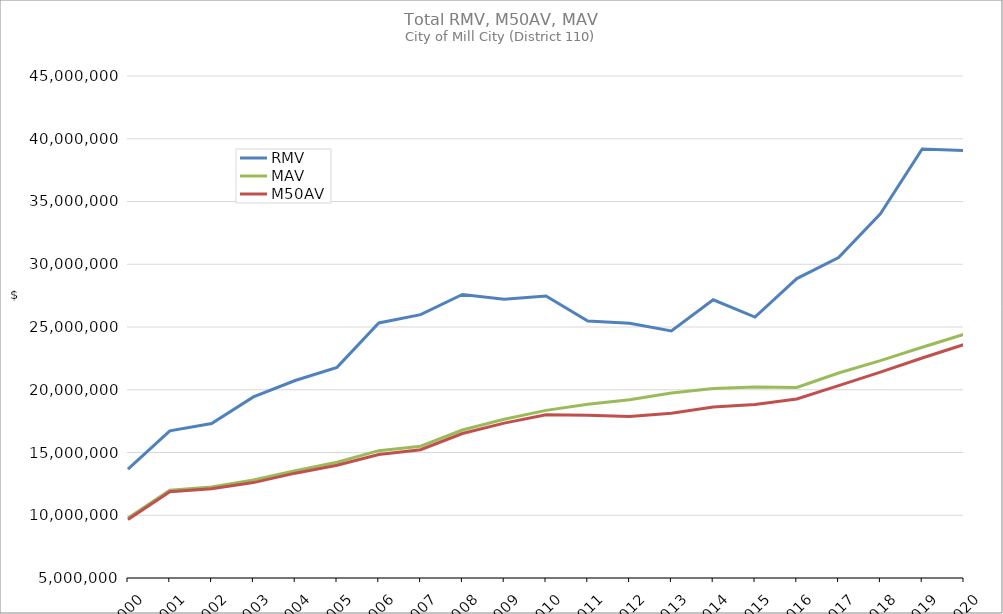
| Category | RMV | MAV | M50AV |
|---|---|---|---|
| 2000.0 | 13667851 | 9772325 | 9667129 |
| 2001.0 | 16729376 | 11993076 | 11867345 |
| 2002.0 | 17314676 | 12256107 | 12108067 |
| 2003.0 | 19429884 | 12813206 | 12601222 |
| 2004.0 | 20735879 | 13551110 | 13353790 |
| 2005.0 | 21787619 | 14229383 | 13985580 |
| 2006.0 | 25321157 | 15145735 | 14841889 |
| 2007.0 | 25985432 | 15500269 | 15219171 |
| 2008.0 | 27594593 | 16789172 | 16515208 |
| 2009.0 | 27218950 | 17652601 | 17341022 |
| 2010.0 | 27465777 | 18356986 | 18007508 |
| 2011.0 | 25477899 | 18845165 | 17958756 |
| 2012.0 | 25292000 | 19198149 | 17875797 |
| 2013.0 | 24687826 | 19748648 | 18128045 |
| 2014.0 | 27167741 | 20104877 | 18616160 |
| 2015.0 | 25793282 | 20209221 | 18831036 |
| 2016.0 | 28858863 | 20183584 | 19263211 |
| 2017.0 | 30537780 | 21336266 | 20333321 |
| 2018.0 | 34011935 | 22321262 | 21401067 |
| 2019.0 | 39186444 | 23389124 | 22529666 |
| 2020.0 | 39061652 | 24420048 | 23600445 |